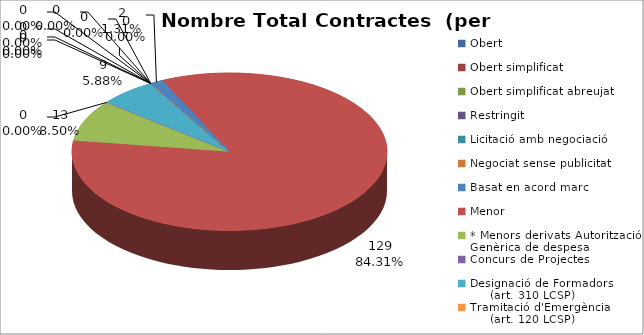
| Category | Nombre Total Contractes |
|---|---|
| Obert | 0 |
| Obert simplificat | 0 |
| Obert simplificat abreujat | 0 |
| Restringit | 0 |
| Licitació amb negociació | 0 |
| Negociat sense publicitat | 0 |
| Basat en acord marc | 2 |
| Menor | 129 |
| * Menors derivats Autorització Genèrica de despesa | 13 |
| Concurs de Projectes | 0 |
| Designació de Formadors
     (art. 310 LCSP) | 9 |
| Tramitació d'Emergència
     (art. 120 LCSP) | 0 |